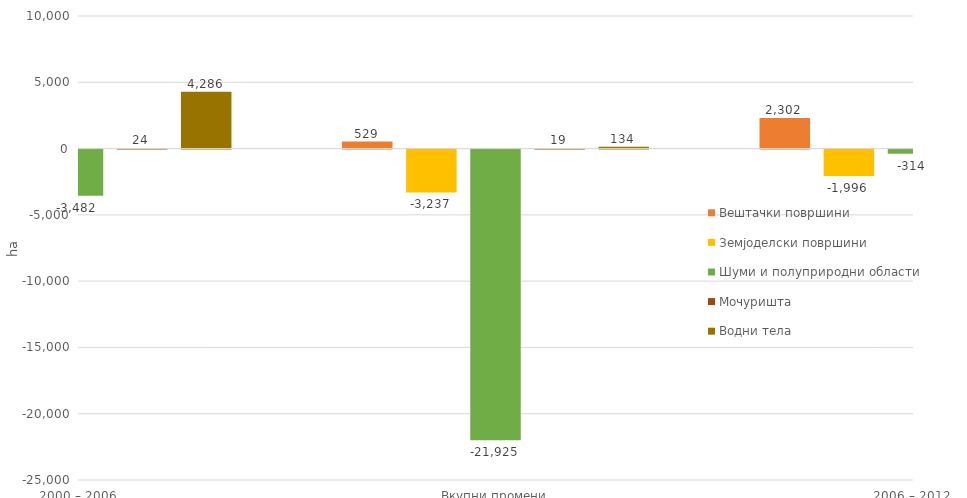
| Category | Вештачки површини | Земјоделски површини | Шуми и полуприродни области | Мочуришта | Водни тела |
|---|---|---|---|---|---|
| 0 | 2629 | -3658 | -3482 | 24 | 4286 |
| 1 | 528.917 | -3236.65 | -21924.837 | 19.048 | 133.876 |
| 2 | 2301.97 | -1995.78 | -314.09 | 31.86 | -23.96 |